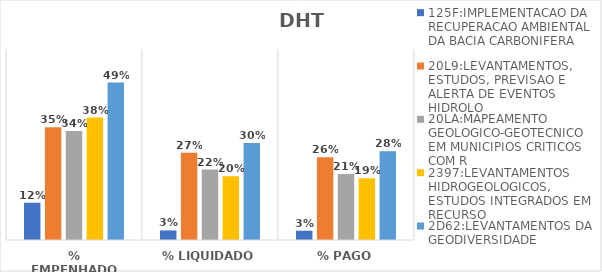
| Category | 125F:IMPLEMENTACAO DA RECUPERACAO AMBIENTAL DA BACIA CARBONIFERA | 20L9:LEVANTAMENTOS, ESTUDOS, PREVISAO E ALERTA DE EVENTOS HIDROLO | 20LA:MAPEAMENTO GEOLOGICO-GEOTECNICO EM MUNICIPIOS CRITICOS COM R | 2397:LEVANTAMENTOS HIDROGEOLOGICOS, ESTUDOS INTEGRADOS EM RECURSO | 2D62:LEVANTAMENTOS DA GEODIVERSIDADE |
|---|---|---|---|---|---|
| % EMPENHADO | 0.117 | 0.355 | 0.343 | 0.384 | 0.495 |
| % LIQUIDADO | 0.03 | 0.274 | 0.221 | 0.2 | 0.305 |
| % PAGO | 0.029 | 0.26 | 0.207 | 0.194 | 0.279 |